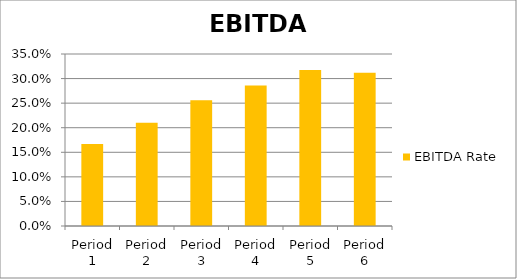
| Category | EBITDA Rate |
|---|---|
| Period 1 | 0.167 |
| Period 2 | 0.21 |
| Period 3 | 0.256 |
| Period 4 | 0.286 |
| Period 5 | 0.317 |
| Period 6 | 0.312 |